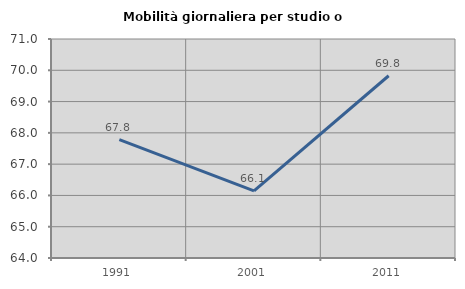
| Category | Mobilità giornaliera per studio o lavoro |
|---|---|
| 1991.0 | 67.783 |
| 2001.0 | 66.148 |
| 2011.0 | 69.826 |